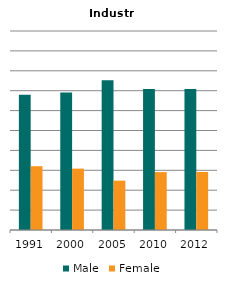
| Category | Male | Female |
|---|---|---|
| 1991.0 | 0.679 | 0.321 |
| 2000.0 | 0.691 | 0.309 |
| 2005.0 | 0.752 | 0.248 |
| 2010.0 | 0.709 | 0.291 |
| 2012.0 | 0.708 | 0.292 |